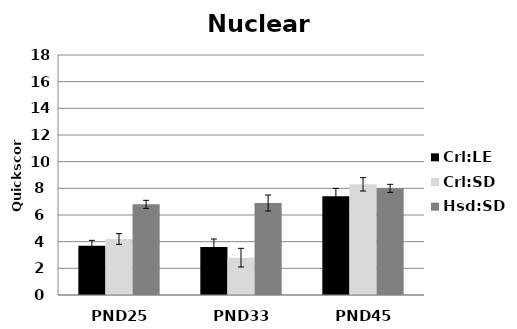
| Category | Crl:LE | Crl:SD | Hsd:SD |
|---|---|---|---|
| PND25 | 3.7 | 4.2 | 6.8 |
| PND33 | 3.6 | 2.8 | 6.9 |
| PND45 | 7.4 | 8.3 | 8 |